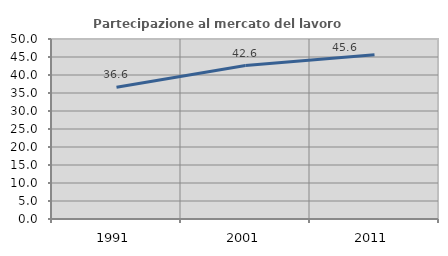
| Category | Partecipazione al mercato del lavoro  femminile |
|---|---|
| 1991.0 | 36.578 |
| 2001.0 | 42.614 |
| 2011.0 | 45.623 |